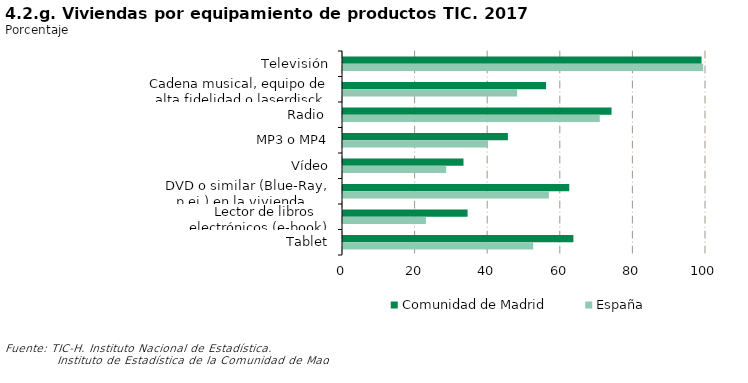
| Category | Comunidad de Madrid | España |
|---|---|---|
| Televisión | 98.775 | 99.212 |
| Cadena musical, equipo de alta fidelidad o laserdisck | 55.94 | 47.967 |
| Radio  | 73.976 | 70.731 |
| MP3 o MP4 | 45.424 | 39.879 |
| Vídeo | 33.194 | 28.428 |
|    DVD o similar (Blue-Ray, p.ej.) en la vivienda | 62.331 | 56.728 |
|    Lector de libros electrónicos (e-book) | 34.317 | 22.841 |
|    Tablet | 63.468 | 52.4 |